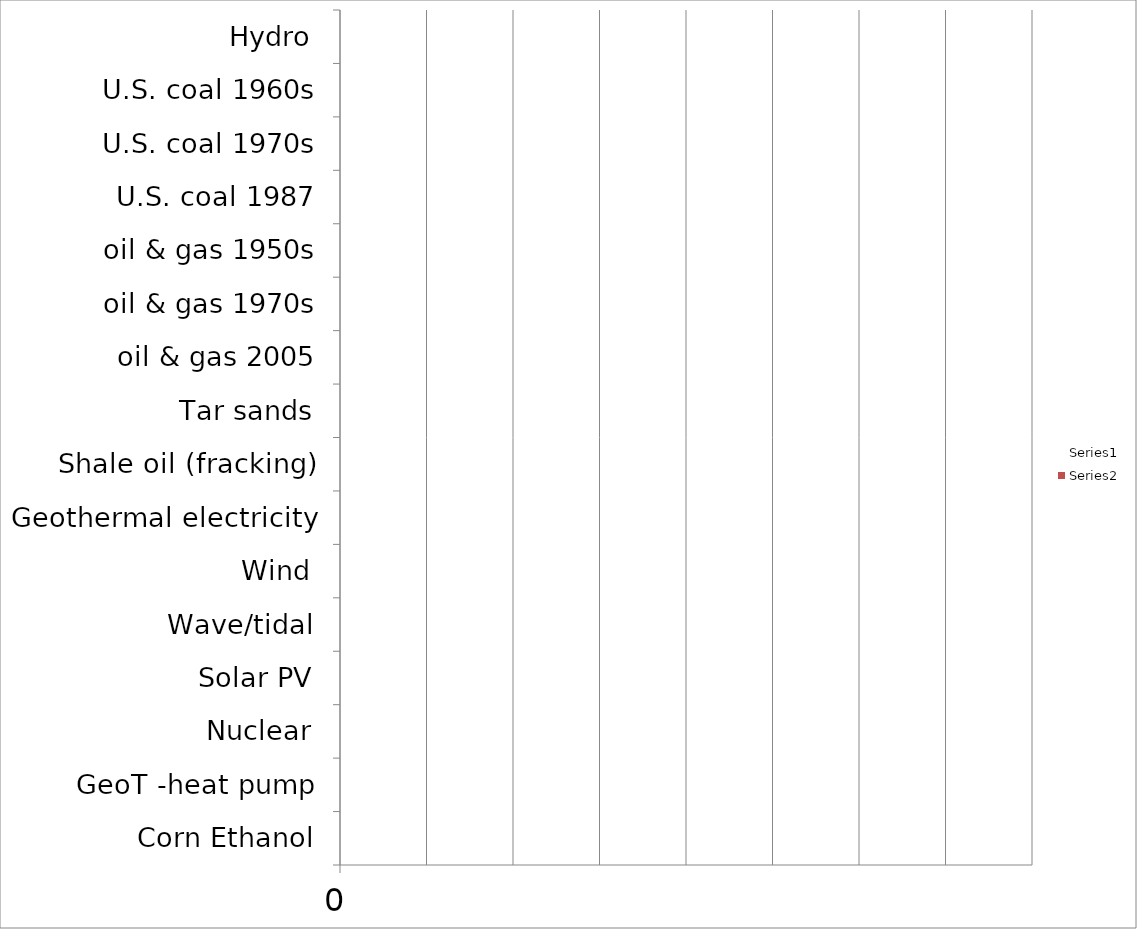
| Category | Series 0 | Series 1 |
|---|---|---|
| Corn Ethanol | 0.8 | 1.2 |
| GeoT -heat pump | 4 | 2 |
| Nuclear | 5 | 3 |
| Solar PV | 3 | 7 |
| Wave/tidal | 14 | 2 |
| Wind | 9 | 21 |
| Geothermal electricity | 6 | 33 |
| Shale oil (fracking) | 3 | 1 |
| Tar sands | 3 | 53 |
| oil & gas 2005 | 11 | 7 |
| oil & gas 1970s | 18 | 4 |
| oil & gas 1950s | 28 | 4 |
| U.S. coal 1987 | 66 | 8 |
| U.S. coal 1970s | 47 | 6 |
| U.S. coal 1960s | 95 | 10 |
| Hydro | 11 | 256 |